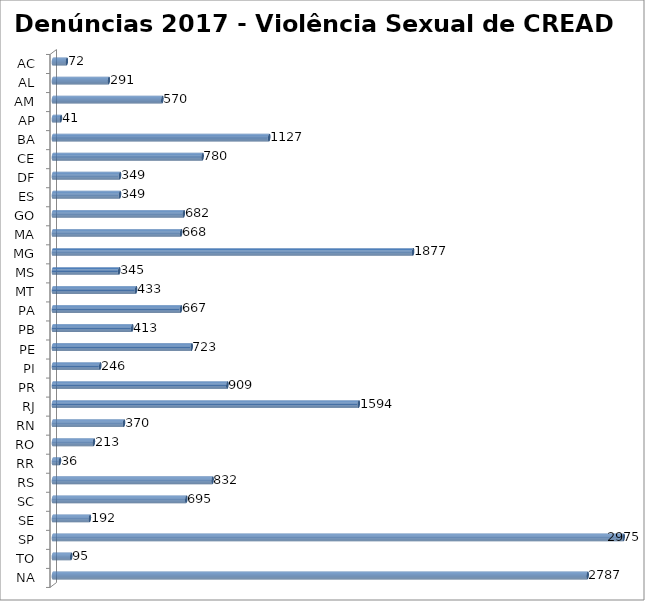
| Category | Series 0 |
|---|---|
| AC | 72 |
| AL | 291 |
| AM | 570 |
| AP | 41 |
| BA | 1127 |
| CE | 780 |
| DF | 349 |
| ES | 349 |
| GO | 682 |
| MA | 668 |
| MG | 1877 |
| MS | 345 |
| MT | 433 |
| PA | 667 |
| PB | 413 |
| PE | 723 |
| PI | 246 |
| PR | 909 |
| RJ | 1594 |
| RN | 370 |
| RO | 213 |
| RR | 36 |
| RS | 832 |
| SC | 695 |
| SE | 192 |
| SP | 2975 |
| TO | 95 |
| NA | 2787 |